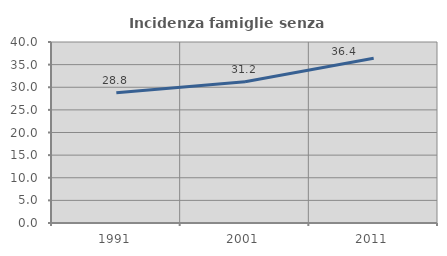
| Category | Incidenza famiglie senza nuclei |
|---|---|
| 1991.0 | 28.795 |
| 2001.0 | 31.214 |
| 2011.0 | 36.396 |